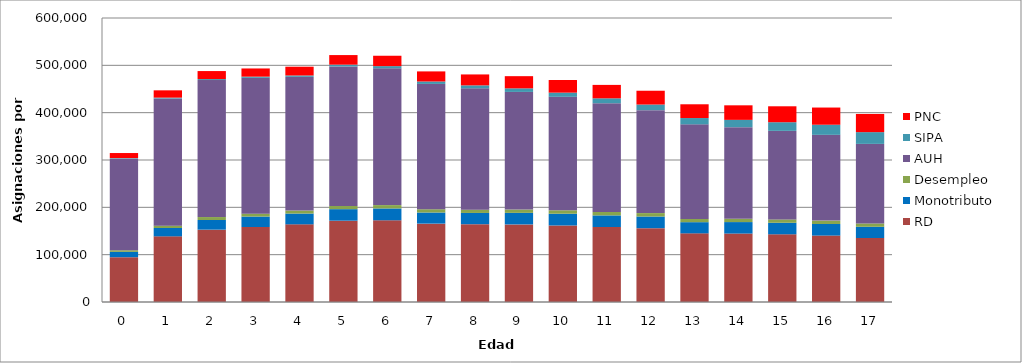
| Category | RD | Monotributo | Desempleo | AUH | SIPA | PNC |
|---|---|---|---|---|---|---|
| 0.0 | 94660 | 11276 | 3413 | 193504 | 1179 | 10683 |
| 1.0 | 138708 | 17651 | 4988 | 268665 | 1747 | 15428 |
| 2.0 | 152834 | 20462 | 6186 | 289425 | 2088 | 16904 |
| 3.0 | 158467 | 22028 | 6095 | 287048 | 2463 | 17295 |
| 4.0 | 164102 | 22734 | 6397 | 282371 | 2966 | 18535 |
| 5.0 | 171777 | 24368 | 6779 | 294651 | 3874 | 20239 |
| 6.0 | 172616 | 25025 | 7094 | 289075 | 4540 | 21901 |
| 7.0 | 165579 | 23477 | 6935 | 264716 | 5164 | 21309 |
| 8.0 | 164375 | 23745 | 6965 | 256405 | 6197 | 23091 |
| 9.0 | 163905 | 24398 | 7046 | 248464 | 7575 | 25735 |
| 10.0 | 161665 | 24801 | 7319 | 239720 | 8810 | 26656 |
| 11.0 | 158442 | 24500 | 7224 | 229800 | 10341 | 28364 |
| 12.0 | 155981 | 24594 | 7293 | 217469 | 11834 | 29164 |
| 13.0 | 145048 | 23614 | 6840 | 199855 | 13279 | 29088 |
| 14.0 | 144608 | 24244 | 6973 | 193516 | 15448 | 30738 |
| 15.0 | 143048 | 24308 | 7122 | 187040 | 18298 | 33666 |
| 16.0 | 140354 | 24429 | 7196 | 181176 | 21373 | 36306 |
| 17.0 | 135189 | 23712 | 7036 | 168065 | 24868 | 38444 |